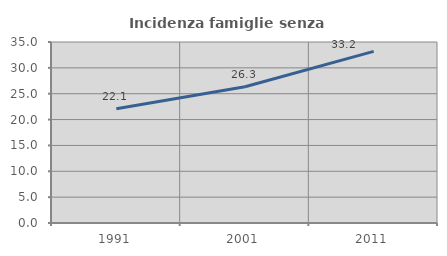
| Category | Incidenza famiglie senza nuclei |
|---|---|
| 1991.0 | 22.109 |
| 2001.0 | 26.336 |
| 2011.0 | 33.192 |